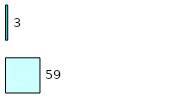
| Category | Series 0 | Series 1 |
|---|---|---|
| 0 | 59 | 3 |